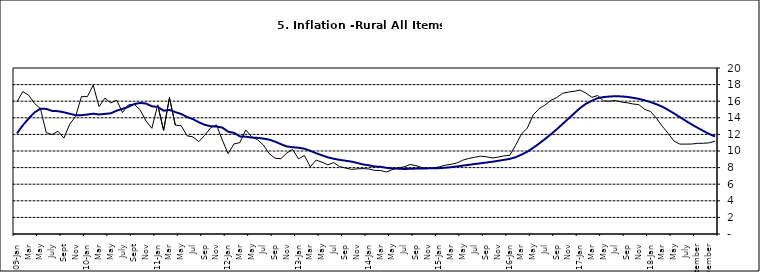
| Category | Series 0 | Series 1 |
|---|---|---|
| 09-Jan | 15.918 | 12.128 |
| Feb | 17.154 | 13.086 |
| Mar | 16.729 | 13.912 |
| Apr | 15.727 | 14.644 |
| May | 15.113 | 15.104 |
| June | 12.213 | 15.067 |
| July | 11.974 | 14.832 |
| Aug | 12.38 | 14.796 |
| Sept | 11.548 | 14.661 |
| Oct | 13.242 | 14.488 |
| Nov | 14.164 | 14.321 |
|  | 16.557 | 14.316 |
| 10-Jan | 16.548 | 14.39 |
| Feb | 17.934 | 14.494 |
| Mar | 15.346 | 14.401 |
| Apr | 16.373 | 14.473 |
| May | 15.794 | 14.54 |
| June | 16.126 | 14.862 |
| July | 14.634 | 15.072 |
| Aug | 15.556 | 15.33 |
| Sept | 15.616 | 15.658 |
| Oct | 14.955 | 15.786 |
| Nov | 13.616 | 15.719 |
| Dec | 12.735 | 15.385 |
| 11-Jan | 15.553 | 15.311 |
| Feb | 12.482 | 14.856 |
| Mar | 16.422 | 14.956 |
| Apr | 13.117 | 14.687 |
| May | 13.041 | 14.457 |
| Jun | 11.83 | 14.095 |
| Jul | 11.699 | 13.84 |
| Aug | 11.13 | 13.464 |
| Sep | 11.878 | 13.156 |
| Oct | 12.778 | 12.985 |
| Nov | 13.147 | 12.95 |
| Dec | 11.326 | 12.824 |
| 12-Jan | 9.678 | 12.33 |
| Feb | 10.856 | 12.188 |
| Mar | 11.014 | 11.76 |
| Apr | 12.536 | 11.724 |
| May | 11.712 | 11.621 |
| Jun | 11.36 | 11.582 |
| Jul | 10.733 | 11.499 |
| Aug | 9.683 | 11.368 |
| Sep | 9.132 | 11.131 |
| Oct | 9.071 | 10.82 |
| Nov | 9.758 | 10.548 |
| Dec | 10.183 | 10.455 |
| 13-Jan | 9.052 | 10.394 |
| Feb | 9.457 | 10.276 |
| Mar | 8.091 | 10.025 |
| Apr | 8.907 | 9.732 |
| May | 8.647 | 9.483 |
| Jun | 8.333 | 9.236 |
| Jul | 8.6 | 9.063 |
| Aug | 8.12 | 8.933 |
| Sep | 7.95 | 8.832 |
| Oct | 7.791 | 8.722 |
| Nov | 7.849 | 8.565 |
| Dec | 7.879 | 8.378 |
| 14-Jan | 7.832 | 8.277 |
| Feb | 7.657 | 8.13 |
| Mar | 7.65 | 8.092 |
| Apr | 7.473 | 7.973 |
| May | 7.761 | 7.901 |
| Jun | 7.98 | 7.874 |
| Jul | 8.086 | 7.834 |
| Aug | 8.368 | 7.858 |
| Sep | 8.244 | 7.883 |
| Oct | 8.019 | 7.903 |
| Nov | 7.898 | 7.906 |
| Dec | 7.955 | 7.913 |
| 15-Jan | 8.094 | 7.935 |
| Feb | 8.291 | 7.988 |
| Mar | 8.396 | 8.05 |
| Apr | 8.556 | 8.14 |
| May | 8.896 | 8.236 |
| Jun | 9.098 | 8.331 |
| Jul | 9.238 | 8.429 |
| Aug | 9.382 | 8.516 |
| Sep | 9.3 | 8.606 |
| Oct | 9.162 | 8.7 |
| Nov | 9.261 | 8.813 |
| Dec | 9.41 | 8.933 |
| 16-Jan | 9.48 | 9.047 |
| Feb | 10.692 | 9.249 |
| Mar | 12.038 | 9.559 |
| Apr | 12.767 | 9.917 |
| May | 14.349 | 10.384 |
| Jun | 15.088 | 10.897 |
| Jul | 15.533 | 11.433 |
| Aug | 16.103 | 12.002 |
| Sep | 16.428 | 12.601 |
| Oct | 16.947 | 13.25 |
| Nov | 17.099 | 13.898 |
| Dec | 17.195 | 14.54 |
| 17-Jan | 17.341 | 15.183 |
| Feb | 16.982 | 15.696 |
| Mar | 16.466 | 16.054 |
| Apr | 16.687 | 16.369 |
| May | 16.023 | 16.497 |
| Jun | 16.007 | 16.563 |
| Jul | 16.078 | 16.6 |
| Aug | 15.914 | 16.577 |
| Sep | 15.812 | 16.52 |
| Oct | 15.666 | 16.411 |
| Nov | 15.587 | 16.285 |
| Dec | 15.018 | 16.104 |
| 18-Jan | 14.756 | 15.892 |
| Feb | 13.957 | 15.638 |
| Mar | 12.987 | 15.339 |
| Apr | 12.126 | 14.95 |
| May | 11.199 | 14.53 |
| June | 10.832 | 14.083 |
| July | 10.831 | 13.636 |
| August | 10.838 | 13.209 |
| September | 10.924 | 12.804 |
| October | 10.927 | 12.418 |
| November | 10.986 | 12.049 |
| December | 11.183 | 11.746 |